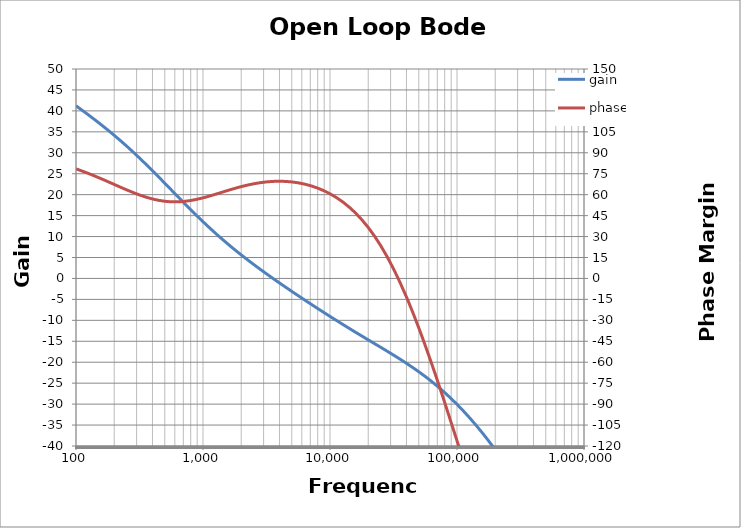
| Category | gain |
|---|---|
| 100.0 | 41.218 |
| 125.8925411794168 | 38.993 |
| 158.48931924611136 | 36.662 |
| 199.52623149688804 | 34.192 |
| 251.188643150958 | 31.558 |
| 316.227766016838 | 28.749 |
| 398.10717055349755 | 25.782 |
| 501.18723362727235 | 22.705 |
| 630.9573444801937 | 19.588 |
| 794.328234724282 | 16.512 |
| 1000.0 | 13.547 |
| 1258.9254117941678 | 10.74 |
| 1584.8931924611154 | 8.108 |
| 1995.2623149688802 | 5.643 |
| 2511.8864315095807 | 3.317 |
| 3162.2776601683827 | 1.101 |
| 3981.071705534976 | -1.034 |
| 5011.872336272727 | -3.108 |
| 6309.573444801932 | -5.134 |
| 7943.282347242821 | -7.119 |
| 10000.0 | -9.063 |
| 12589.25411794168 | -10.964 |
| 15848.931924611155 | -12.822 |
| 19952.623149688803 | -14.645 |
| 25118.864315095812 | -16.454 |
| 31622.776601683803 | -18.292 |
| 39810.71705534977 | -20.217 |
| 50118.72336272732 | -22.294 |
| 63095.734448019386 | -24.588 |
| 79432.82347242815 | -27.159 |
| 100000.0 | -30.051 |
| 125892.54117941672 | -33.291 |
| 158489.31924611147 | -36.888 |
| 199526.23149688792 | -40.843 |
| 251188.64315095858 | -45.157 |
| 316227.7660168384 | -49.837 |
| 398107.1705534974 | -54.892 |
| 501187.23362727294 | -60.326 |
| 630957.3444801935 | -66.135 |
| 794328.2347242824 | -72.312 |
| 1000000.0 | -78.842 |